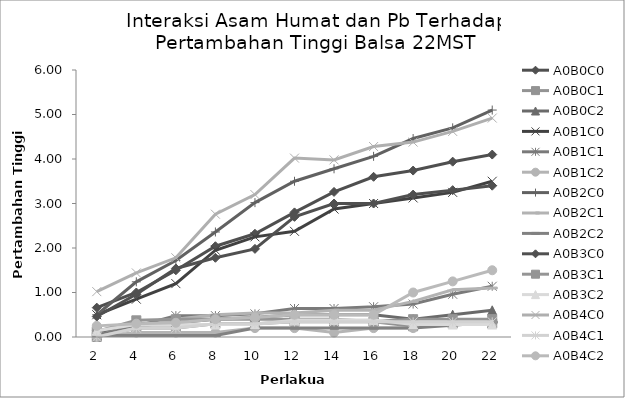
| Category | A0B0C0 | A0B0C1 | A0B0C2 | A0B1C0 | A0B1C1 | A0B1C2 | A0B2C0 | A0B2C1 | A0B2C2 | A0B3C0 | A0B3C1 | A0B3C2 | A0B4C0 | A0B4C1 | A0B4C2 |
|---|---|---|---|---|---|---|---|---|---|---|---|---|---|---|---|
| 2.0 | 0.66 | 0 | 0.1 | 0.5 | 0.04 | 0 | 0.5 | 0 | 0.033 | 0.46 | 0.125 | 0.14 | 1.02 | 0 | 0.25 |
| 4.0 | 1 | 0.2 | 0.3 | 0.85 | 0.24 | 0.1 | 1.24 | 0.2 | 0.033 | 0.96 | 0.375 | 0.28 | 1.44 | 0.2 | 0.3 |
| 6.0 | 1.5 | 0.2 | 0.32 | 1.2 | 0.48 | 0.1 | 1.72 | 0.4 | 0.033 | 1.54 | 0.4 | 0.28 | 1.78 | 0.2 | 0.32 |
| 8.0 | 2.04 | 0.3 | 0.4 | 1.95 | 0.48 | 0.1 | 2.36 | 0.5 | 0.033 | 1.78 | 0.4 | 0.28 | 2.76 | 0.3 | 0.4 |
| 10.0 | 2.32 | 0.3 | 0.44 | 2.25 | 0.52 | 0.2 | 3.02 | 0.54 | 0.2 | 1.98 | 0.4 | 0.28 | 3.2 | 0.3 | 0.44 |
| 12.0 | 2.8 | 0.34 | 0.5 | 2.375 | 0.64 | 0.2 | 3.5 | 0.54 | 0.2 | 2.7 | 0.4 | 0.38 | 4.02 | 0.34 | 0.5 |
| 14.0 | 3.26 | 0.34 | 0.5 | 2.875 | 0.64 | 0.1 | 3.78 | 0.6 | 0.2 | 3 | 0.4 | 0.38 | 3.98 | 0.34 | 0.5 |
| 16.0 | 3.6 | 0.34 | 0.5 | 3 | 0.68 | 0.2 | 4.06 | 0.6 | 0.2 | 3 | 0.35 | 0.38 | 4.28 | 0.34 | 0.5 |
| 18.0 | 3.74 | 0.24 | 0.4 | 3.125 | 0.74 | 0.2 | 4.46 | 0.8 | 0.2 | 3.2 | 0.4 | 0.28 | 4.38 | 0.34 | 1 |
| 20.0 | 3.94 | 0.3 | 0.5 | 3.25 | 0.96 | 0.34 | 4.7 | 1.06 | 0.267 | 3.3 | 0.4 | 0.28 | 4.62 | 0.34 | 1.25 |
| 22.0 | 4.1 | 0.3 | 0.6 | 3.5 | 1.14 | 0.34 | 5.1 | 1.1 | 0.333 | 3.4 | 0.4 | 0.28 | 4.92 | 0.34 | 1.5 |